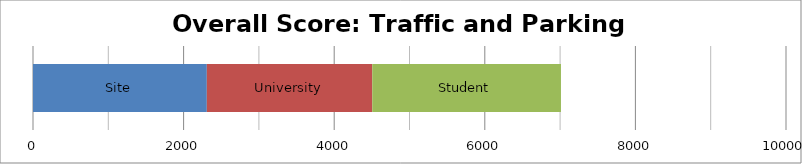
| Category | Site | University | Student |
|---|---|---|---|
| 0 | 2308.5 | 2196.75 | 2506.25 |